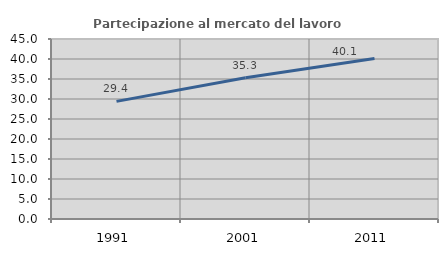
| Category | Partecipazione al mercato del lavoro  femminile |
|---|---|
| 1991.0 | 29.4 |
| 2001.0 | 35.335 |
| 2011.0 | 40.12 |